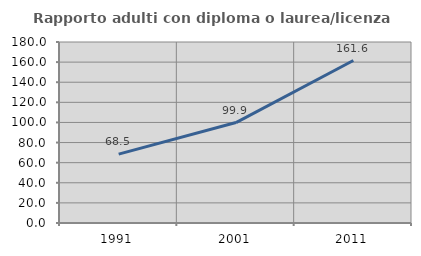
| Category | Rapporto adulti con diploma o laurea/licenza media  |
|---|---|
| 1991.0 | 68.504 |
| 2001.0 | 99.883 |
| 2011.0 | 161.585 |